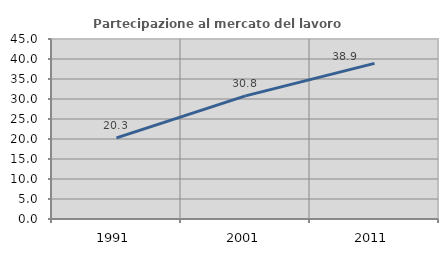
| Category | Partecipazione al mercato del lavoro  femminile |
|---|---|
| 1991.0 | 20.273 |
| 2001.0 | 30.785 |
| 2011.0 | 38.906 |